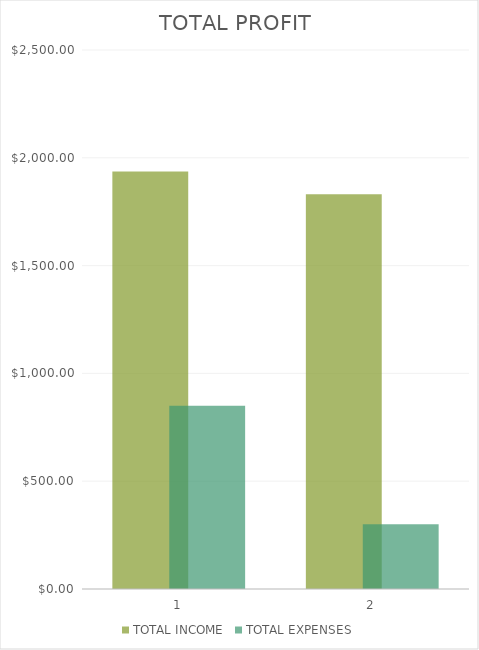
| Category | TOTAL INCOME | TOTAL EXPENSES |
|---|---|---|
| 0 | 1936 | 850 |
| 1 | 1831 | 300 |